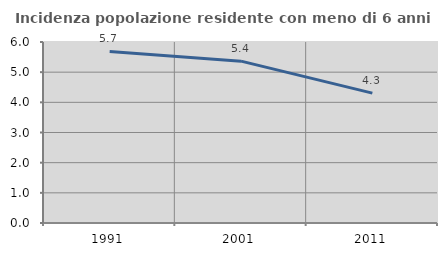
| Category | Incidenza popolazione residente con meno di 6 anni |
|---|---|
| 1991.0 | 5.688 |
| 2001.0 | 5.366 |
| 2011.0 | 4.304 |